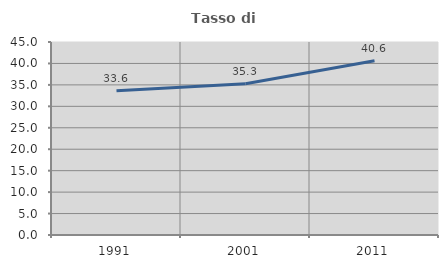
| Category | Tasso di occupazione   |
|---|---|
| 1991.0 | 33.609 |
| 2001.0 | 35.264 |
| 2011.0 | 40.616 |